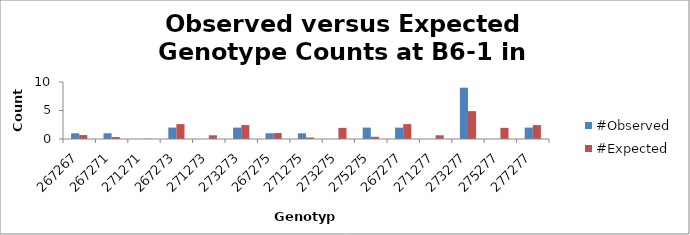
| Category | #Observed | #Expected |
|---|---|---|
| 267267.0 | 1 | 0.696 |
| 267271.0 | 1 | 0.348 |
| 271271.0 | 0 | 0.043 |
| 267273.0 | 2 | 2.609 |
| 271273.0 | 0 | 0.652 |
| 273273.0 | 2 | 2.446 |
| 267275.0 | 1 | 1.043 |
| 271275.0 | 1 | 0.261 |
| 273275.0 | 0 | 1.957 |
| 275275.0 | 2 | 0.391 |
| 267277.0 | 2 | 2.609 |
| 271277.0 | 0 | 0.652 |
| 273277.0 | 9 | 4.891 |
| 275277.0 | 0 | 1.957 |
| 277277.0 | 2 | 2.446 |